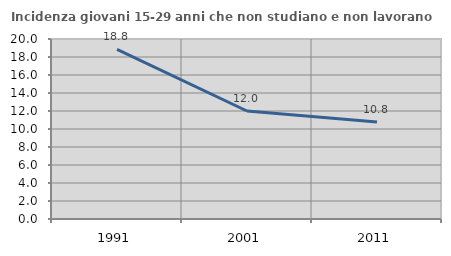
| Category | Incidenza giovani 15-29 anni che non studiano e non lavorano  |
|---|---|
| 1991.0 | 18.844 |
| 2001.0 | 12 |
| 2011.0 | 10.787 |